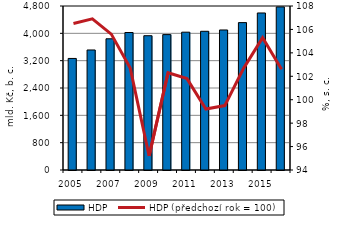
| Category | HDP |
|---|---|
| 2005.0 | 3264.9 |
| 2006.0 | 3512.8 |
| 2007.0 | 3840.1 |
| 2008.0 | 4024.1 |
| 2009.0 | 3930.4 |
| 2010.0 | 3962.5 |
| 2011.0 | 4033.8 |
| 2012.0 | 4059.9 |
| 2013.0 | 4098.1 |
| 2014.0 | 4313.8 |
| 2015.0 | 4595.8 |
| 2016.0 | 4773.2 |